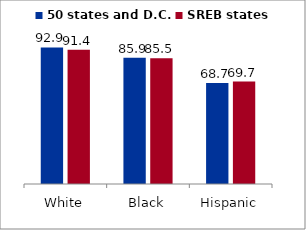
| Category | 50 states and D.C. | SREB states |
|---|---|---|
| White | 92.885 | 91.357 |
| Black | 85.862 | 85.503 |
| Hispanic | 68.698 | 69.712 |